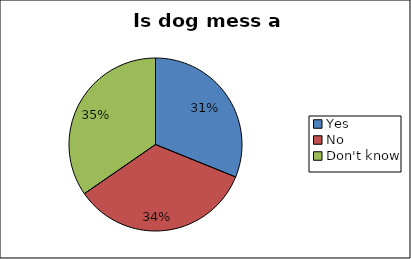
| Category | Series 0 |
|---|---|
| Yes | 0.311 |
| No | 0.342 |
| Don't know | 0.346 |